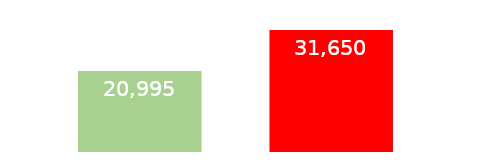
| Category | IRPEF + FLAT TAX INCREM.LE | SOLO IRPEF  |
|---|---|---|
| 0 | 20995 | 31650 |